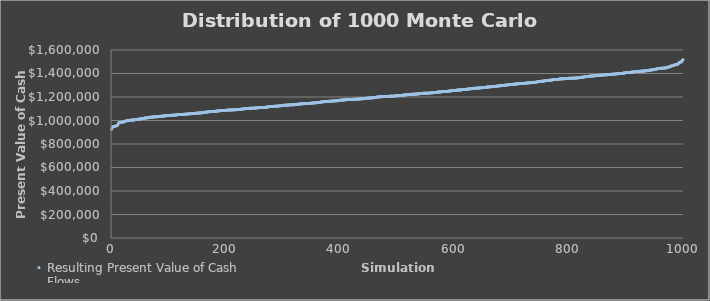
| Category | Resulting Present Value of Cash Flows |
|---|---|
| 0 | 923953.235 |
| 1 | 942751.115 |
| 2 | 943107.799 |
| 3 | 947489.846 |
| 4 | 947634.425 |
| 5 | 948893.349 |
| 6 | 949835.916 |
| 7 | 953370.071 |
| 8 | 954506.456 |
| 9 | 957458.929 |
| 10 | 958610.411 |
| 11 | 960805.645 |
| 12 | 976433.237 |
| 13 | 980958.894 |
| 14 | 983151.384 |
| 15 | 983854.451 |
| 16 | 984056.374 |
| 17 | 984367.303 |
| 18 | 985392.041 |
| 19 | 985464.978 |
| 20 | 986260.068 |
| 21 | 988174.473 |
| 22 | 990942.176 |
| 23 | 991568.046 |
| 24 | 993565.666 |
| 25 | 996117.555 |
| 26 | 997082.595 |
| 27 | 999191.633 |
| 28 | 1000311.454 |
| 29 | 1000491.718 |
| 30 | 1000514.084 |
| 31 | 1000994.201 |
| 32 | 1001676.945 |
| 33 | 1002463.129 |
| 34 | 1002574.115 |
| 35 | 1003533.318 |
| 36 | 1003634.504 |
| 37 | 1004115.168 |
| 38 | 1004352.263 |
| 39 | 1004792.354 |
| 40 | 1006242.007 |
| 41 | 1007100.56 |
| 42 | 1007272.898 |
| 43 | 1007994.609 |
| 44 | 1009017.469 |
| 45 | 1009068.399 |
| 46 | 1011062.646 |
| 47 | 1011720.852 |
| 48 | 1011821.242 |
| 49 | 1012646.482 |
| 50 | 1012709.366 |
| 51 | 1013240.801 |
| 52 | 1014438.163 |
| 53 | 1015306.698 |
| 54 | 1015332.948 |
| 55 | 1016437.929 |
| 56 | 1017389.427 |
| 57 | 1018799.663 |
| 58 | 1020434.752 |
| 59 | 1021143.177 |
| 60 | 1021473.589 |
| 61 | 1022108.028 |
| 62 | 1022406.377 |
| 63 | 1022479.199 |
| 64 | 1023441.979 |
| 65 | 1024668.91 |
| 66 | 1025789.487 |
| 67 | 1027802.579 |
| 68 | 1027834.05 |
| 69 | 1027840.406 |
| 70 | 1028557.481 |
| 71 | 1029066.117 |
| 72 | 1029609.214 |
| 73 | 1029748.09 |
| 74 | 1030295.147 |
| 75 | 1030987.74 |
| 76 | 1031202.606 |
| 77 | 1031348.194 |
| 78 | 1031501.864 |
| 79 | 1031539.671 |
| 80 | 1031867.178 |
| 81 | 1031868.171 |
| 82 | 1032796.603 |
| 83 | 1033289.965 |
| 84 | 1035172.42 |
| 85 | 1035348.55 |
| 86 | 1035519.295 |
| 87 | 1037140.524 |
| 88 | 1037146.299 |
| 89 | 1037469.414 |
| 90 | 1037626.013 |
| 91 | 1037688.967 |
| 92 | 1038278.715 |
| 93 | 1039502.721 |
| 94 | 1040480.464 |
| 95 | 1040565.702 |
| 96 | 1041041.71 |
| 97 | 1041953.386 |
| 98 | 1042270.511 |
| 99 | 1042284.306 |
| 100 | 1042340.241 |
| 101 | 1042356.052 |
| 102 | 1043368.837 |
| 103 | 1043948.374 |
| 104 | 1044099.22 |
| 105 | 1044346.623 |
| 106 | 1044823.921 |
| 107 | 1044956.803 |
| 108 | 1045137.406 |
| 109 | 1045205.545 |
| 110 | 1045297.61 |
| 111 | 1046464.327 |
| 112 | 1046698.667 |
| 113 | 1046903.049 |
| 114 | 1048425.637 |
| 115 | 1049271.727 |
| 116 | 1050037.227 |
| 117 | 1050183.094 |
| 118 | 1050208.231 |
| 119 | 1050515.642 |
| 120 | 1050728.775 |
| 121 | 1050809.85 |
| 122 | 1050896.644 |
| 123 | 1051337.087 |
| 124 | 1051602.556 |
| 125 | 1051902.131 |
| 126 | 1052525.044 |
| 127 | 1053638.29 |
| 128 | 1053691.254 |
| 129 | 1053858.558 |
| 130 | 1054273.474 |
| 131 | 1054413.38 |
| 132 | 1054988.406 |
| 133 | 1055659.097 |
| 134 | 1055787.91 |
| 135 | 1056568.799 |
| 136 | 1057187.448 |
| 137 | 1057448.054 |
| 138 | 1057532.342 |
| 139 | 1057659.173 |
| 140 | 1058509.346 |
| 141 | 1059151.853 |
| 142 | 1059352.133 |
| 143 | 1059788.373 |
| 144 | 1059998.501 |
| 145 | 1060304.52 |
| 146 | 1060359.14 |
| 147 | 1061753.644 |
| 148 | 1061767.131 |
| 149 | 1061902.451 |
| 150 | 1062811.791 |
| 151 | 1063052.804 |
| 152 | 1063668.361 |
| 153 | 1063989.485 |
| 154 | 1064010.879 |
| 155 | 1064299.579 |
| 156 | 1064815.465 |
| 157 | 1064923.523 |
| 158 | 1065674.228 |
| 159 | 1066197.032 |
| 160 | 1067869.774 |
| 161 | 1068627.102 |
| 162 | 1069500.409 |
| 163 | 1069668.188 |
| 164 | 1070168.18 |
| 165 | 1070349.461 |
| 166 | 1070604.477 |
| 167 | 1071605.843 |
| 168 | 1073394.129 |
| 169 | 1074439.218 |
| 170 | 1074674.11 |
| 171 | 1074707.431 |
| 172 | 1075112.371 |
| 173 | 1075557.723 |
| 174 | 1075995.01 |
| 175 | 1076444.259 |
| 176 | 1076926.962 |
| 177 | 1077126.627 |
| 178 | 1077639.644 |
| 179 | 1077707.411 |
| 180 | 1077805.772 |
| 181 | 1078106.423 |
| 182 | 1078498.348 |
| 183 | 1078541.3 |
| 184 | 1079596.582 |
| 185 | 1081232.688 |
| 186 | 1081377.943 |
| 187 | 1081649.775 |
| 188 | 1082886.731 |
| 189 | 1082955.241 |
| 190 | 1083124.688 |
| 191 | 1084012.946 |
| 192 | 1084149.601 |
| 193 | 1084685.884 |
| 194 | 1085195.502 |
| 195 | 1085201.297 |
| 196 | 1085392.316 |
| 197 | 1085490.809 |
| 198 | 1086248.307 |
| 199 | 1086398.35 |
| 200 | 1086635.662 |
| 201 | 1088108.649 |
| 202 | 1088322.709 |
| 203 | 1088343.235 |
| 204 | 1088405.887 |
| 205 | 1088907.524 |
| 206 | 1089036.696 |
| 207 | 1089364.804 |
| 208 | 1089419.524 |
| 209 | 1089521.104 |
| 210 | 1089752.331 |
| 211 | 1089816.987 |
| 212 | 1090258.736 |
| 213 | 1090322.897 |
| 214 | 1090581.962 |
| 215 | 1090970.002 |
| 216 | 1091565.514 |
| 217 | 1091762.02 |
| 218 | 1091889.697 |
| 219 | 1092721.19 |
| 220 | 1093319.769 |
| 221 | 1093359.357 |
| 222 | 1093469.702 |
| 223 | 1094375.943 |
| 224 | 1094846.943 |
| 225 | 1095073.41 |
| 226 | 1095118.664 |
| 227 | 1096212.258 |
| 228 | 1096357.737 |
| 229 | 1098337.99 |
| 230 | 1099346.671 |
| 231 | 1099957.927 |
| 232 | 1100135.935 |
| 233 | 1100213.154 |
| 234 | 1100432.201 |
| 235 | 1100810.435 |
| 236 | 1100943.095 |
| 237 | 1102035.104 |
| 238 | 1102132.465 |
| 239 | 1102549.946 |
| 240 | 1102669.534 |
| 241 | 1103710.267 |
| 242 | 1103877.972 |
| 243 | 1103894.755 |
| 244 | 1104394.866 |
| 245 | 1104897.841 |
| 246 | 1104984.325 |
| 247 | 1105063.895 |
| 248 | 1105356.411 |
| 249 | 1105493.89 |
| 250 | 1105505.078 |
| 251 | 1105811.514 |
| 252 | 1106401.805 |
| 253 | 1107084.802 |
| 254 | 1107525.103 |
| 255 | 1107565.028 |
| 256 | 1107576.281 |
| 257 | 1108754.885 |
| 258 | 1109264.494 |
| 259 | 1109358.77 |
| 260 | 1109530.384 |
| 261 | 1109568.716 |
| 262 | 1109573.508 |
| 263 | 1109603.546 |
| 264 | 1110120.018 |
| 265 | 1110141.024 |
| 266 | 1110174.186 |
| 267 | 1110606.119 |
| 268 | 1111064.632 |
| 269 | 1111435.97 |
| 270 | 1114213.332 |
| 271 | 1114345.354 |
| 272 | 1114480.359 |
| 273 | 1115386.257 |
| 274 | 1115763.049 |
| 275 | 1116244.788 |
| 276 | 1118911.373 |
| 277 | 1118952.124 |
| 278 | 1119251.486 |
| 279 | 1119958.309 |
| 280 | 1119969.511 |
| 281 | 1119991.362 |
| 282 | 1120188.911 |
| 283 | 1120577.976 |
| 284 | 1120860.039 |
| 285 | 1120880.908 |
| 286 | 1121162.681 |
| 287 | 1121744.177 |
| 288 | 1121747.992 |
| 289 | 1121880.658 |
| 290 | 1122629.616 |
| 291 | 1122753.016 |
| 292 | 1123902.371 |
| 293 | 1124181.796 |
| 294 | 1124562.876 |
| 295 | 1124579.815 |
| 296 | 1124931.689 |
| 297 | 1126439.623 |
| 298 | 1127648.672 |
| 299 | 1128338.66 |
| 300 | 1128823.697 |
| 301 | 1129609.362 |
| 302 | 1130221.838 |
| 303 | 1130353.409 |
| 304 | 1130365.479 |
| 305 | 1130436.643 |
| 306 | 1131175.444 |
| 307 | 1131176.741 |
| 308 | 1131842.775 |
| 309 | 1131850.617 |
| 310 | 1132372.48 |
| 311 | 1132866.942 |
| 312 | 1133134.584 |
| 313 | 1133135.712 |
| 314 | 1133379.427 |
| 315 | 1133435.12 |
| 316 | 1133587.163 |
| 317 | 1133612.491 |
| 318 | 1133854.034 |
| 319 | 1134334.487 |
| 320 | 1134658.56 |
| 321 | 1134713.626 |
| 322 | 1135508.484 |
| 323 | 1135857.702 |
| 324 | 1137226.289 |
| 325 | 1138187.641 |
| 326 | 1138372.884 |
| 327 | 1139398.889 |
| 328 | 1139572.82 |
| 329 | 1139926.199 |
| 330 | 1140815.539 |
| 331 | 1141816.785 |
| 332 | 1142231.71 |
| 333 | 1142583.019 |
| 334 | 1142727.469 |
| 335 | 1142806.724 |
| 336 | 1142983.395 |
| 337 | 1143024.186 |
| 338 | 1143369.243 |
| 339 | 1143567.526 |
| 340 | 1143861.757 |
| 341 | 1143906.991 |
| 342 | 1144190.618 |
| 343 | 1144400.22 |
| 344 | 1144567.556 |
| 345 | 1145268.731 |
| 346 | 1145898.092 |
| 347 | 1145991.507 |
| 348 | 1147201.765 |
| 349 | 1147499.039 |
| 350 | 1147966.388 |
| 351 | 1148471.341 |
| 352 | 1148505.896 |
| 353 | 1148578.239 |
| 354 | 1149923.979 |
| 355 | 1150476.056 |
| 356 | 1150742.995 |
| 357 | 1150804.022 |
| 358 | 1150811.991 |
| 359 | 1151638.85 |
| 360 | 1152464.172 |
| 361 | 1152580.591 |
| 362 | 1152606.491 |
| 363 | 1152699.065 |
| 364 | 1153465.277 |
| 365 | 1156702.342 |
| 366 | 1156712.377 |
| 367 | 1156980.245 |
| 368 | 1158631.312 |
| 369 | 1158697.213 |
| 370 | 1159468.513 |
| 371 | 1160081.729 |
| 372 | 1160093.139 |
| 373 | 1160398.745 |
| 374 | 1160466.429 |
| 375 | 1160898.547 |
| 376 | 1161402.491 |
| 377 | 1162156.269 |
| 378 | 1162760.461 |
| 379 | 1163373.988 |
| 380 | 1163836.237 |
| 381 | 1163839.228 |
| 382 | 1164147.858 |
| 383 | 1164479.181 |
| 384 | 1164812.412 |
| 385 | 1165205.917 |
| 386 | 1165302.469 |
| 387 | 1165408.105 |
| 388 | 1165695.177 |
| 389 | 1165695.177 |
| 390 | 1166497.641 |
| 391 | 1167009.789 |
| 392 | 1167736.177 |
| 393 | 1167903.131 |
| 394 | 1168001.734 |
| 395 | 1168828.217 |
| 396 | 1169553.963 |
| 397 | 1170020.054 |
| 398 | 1172002.573 |
| 399 | 1172357.466 |
| 400 | 1172545.005 |
| 401 | 1172752.917 |
| 402 | 1173009.16 |
| 403 | 1173749.613 |
| 404 | 1173948.273 |
| 405 | 1174723.207 |
| 406 | 1174918.439 |
| 407 | 1175620.054 |
| 408 | 1176083.993 |
| 409 | 1176511.425 |
| 410 | 1176540.589 |
| 411 | 1178153.198 |
| 412 | 1178363.803 |
| 413 | 1178430.524 |
| 414 | 1178655.672 |
| 415 | 1178711.132 |
| 416 | 1178874.566 |
| 417 | 1178944.423 |
| 418 | 1179147.623 |
| 419 | 1179389.427 |
| 420 | 1179607.145 |
| 421 | 1179949.403 |
| 422 | 1180128.227 |
| 423 | 1180361.794 |
| 424 | 1180582.272 |
| 425 | 1181333.597 |
| 426 | 1181449.45 |
| 427 | 1181730.271 |
| 428 | 1182125.127 |
| 429 | 1182129.953 |
| 430 | 1182402.022 |
| 431 | 1182411.098 |
| 432 | 1182447.176 |
| 433 | 1182780.513 |
| 434 | 1183672.784 |
| 435 | 1183738.826 |
| 436 | 1184172.144 |
| 437 | 1184461.659 |
| 438 | 1184777.653 |
| 439 | 1184881.699 |
| 440 | 1185358.703 |
| 441 | 1185963.896 |
| 442 | 1187724.443 |
| 443 | 1188172.753 |
| 444 | 1188318.2 |
| 445 | 1189281.473 |
| 446 | 1190118.052 |
| 447 | 1190220.505 |
| 448 | 1190519.634 |
| 449 | 1190573.125 |
| 450 | 1190950.149 |
| 451 | 1191300.217 |
| 452 | 1191578.966 |
| 453 | 1192233.46 |
| 454 | 1192406.606 |
| 455 | 1193184.281 |
| 456 | 1193429.439 |
| 457 | 1193532.255 |
| 458 | 1193608.769 |
| 459 | 1195239.035 |
| 460 | 1195884.283 |
| 461 | 1196375.683 |
| 462 | 1196922.666 |
| 463 | 1198508.451 |
| 464 | 1199152.367 |
| 465 | 1199762.849 |
| 466 | 1199799.817 |
| 467 | 1200748.162 |
| 468 | 1201124.358 |
| 469 | 1201782.415 |
| 470 | 1201849.337 |
| 471 | 1202109.68 |
| 472 | 1202402.886 |
| 473 | 1202825.249 |
| 474 | 1202836.646 |
| 475 | 1202999.058 |
| 476 | 1203150.861 |
| 477 | 1203215.238 |
| 478 | 1203770.589 |
| 479 | 1204299.428 |
| 480 | 1204760.121 |
| 481 | 1204875.538 |
| 482 | 1205264.663 |
| 483 | 1205348.261 |
| 484 | 1205750.946 |
| 485 | 1206223.634 |
| 486 | 1206780.681 |
| 487 | 1207332.992 |
| 488 | 1207392.278 |
| 489 | 1207394.111 |
| 490 | 1207493.191 |
| 491 | 1207507.854 |
| 492 | 1207517.291 |
| 493 | 1207850.332 |
| 494 | 1207937.797 |
| 495 | 1209157.698 |
| 496 | 1209312.223 |
| 497 | 1210023.35 |
| 498 | 1210357.551 |
| 499 | 1210984.993 |
| 500 | 1211363.248 |
| 501 | 1211478.486 |
| 502 | 1211595.433 |
| 503 | 1211798.809 |
| 504 | 1212658.194 |
| 505 | 1212761.766 |
| 506 | 1213494.063 |
| 507 | 1213686.164 |
| 508 | 1214495.669 |
| 509 | 1215059.586 |
| 510 | 1215480.549 |
| 511 | 1216178.92 |
| 512 | 1217185.567 |
| 513 | 1217315.796 |
| 514 | 1218253.017 |
| 515 | 1218349.321 |
| 516 | 1218402.284 |
| 517 | 1220088.706 |
| 518 | 1220222.195 |
| 519 | 1220502.974 |
| 520 | 1220521.666 |
| 521 | 1221049.38 |
| 522 | 1221739.966 |
| 523 | 1222854.952 |
| 524 | 1222951.696 |
| 525 | 1223098.677 |
| 526 | 1223316.577 |
| 527 | 1223443.667 |
| 528 | 1223630.915 |
| 529 | 1224141.676 |
| 530 | 1224191.085 |
| 531 | 1224389.743 |
| 532 | 1224918.938 |
| 533 | 1225155.192 |
| 534 | 1225506.592 |
| 535 | 1226283.879 |
| 536 | 1226524.284 |
| 537 | 1227445.313 |
| 538 | 1227978.465 |
| 539 | 1228101.482 |
| 540 | 1228567.826 |
| 541 | 1228795.289 |
| 542 | 1229355.324 |
| 543 | 1229821.646 |
| 544 | 1231059.279 |
| 545 | 1231424.293 |
| 546 | 1231562.405 |
| 547 | 1231965.983 |
| 548 | 1231967.341 |
| 549 | 1231968.312 |
| 550 | 1232070.583 |
| 551 | 1232074.194 |
| 552 | 1232727.216 |
| 553 | 1232735.67 |
| 554 | 1232838.35 |
| 555 | 1233237.698 |
| 556 | 1233572.627 |
| 557 | 1234446.131 |
| 558 | 1234987.369 |
| 559 | 1235062.889 |
| 560 | 1235376.184 |
| 561 | 1235977.341 |
| 562 | 1236437.38 |
| 563 | 1237267.095 |
| 564 | 1237471.018 |
| 565 | 1237500.101 |
| 566 | 1237810.806 |
| 567 | 1239051.294 |
| 568 | 1239104.988 |
| 569 | 1240006.012 |
| 570 | 1240830.571 |
| 571 | 1242600.091 |
| 572 | 1242705.517 |
| 573 | 1242954.737 |
| 574 | 1242960.419 |
| 575 | 1243027.984 |
| 576 | 1243251.512 |
| 577 | 1244724.657 |
| 578 | 1245105.163 |
| 579 | 1245648.242 |
| 580 | 1245875.106 |
| 581 | 1246847.241 |
| 582 | 1247174.89 |
| 583 | 1247220.888 |
| 584 | 1247292.064 |
| 585 | 1247898.974 |
| 586 | 1247986.264 |
| 587 | 1248118.104 |
| 588 | 1248340.688 |
| 589 | 1249798.316 |
| 590 | 1250686.933 |
| 591 | 1250857.618 |
| 592 | 1251746.95 |
| 593 | 1251811.15 |
| 594 | 1252139.302 |
| 595 | 1252798.303 |
| 596 | 1253942.296 |
| 597 | 1255473.208 |
| 598 | 1255516.218 |
| 599 | 1255830.063 |
| 600 | 1256370.649 |
| 601 | 1256414.773 |
| 602 | 1256705.957 |
| 603 | 1256958.82 |
| 604 | 1258856.59 |
| 605 | 1258979.885 |
| 606 | 1259043.612 |
| 607 | 1259221.126 |
| 608 | 1259340.527 |
| 609 | 1259411.86 |
| 610 | 1259425.166 |
| 611 | 1259465.96 |
| 612 | 1260909.436 |
| 613 | 1262784.243 |
| 614 | 1262863.421 |
| 615 | 1262973.531 |
| 616 | 1263137.062 |
| 617 | 1263138.116 |
| 618 | 1264851.056 |
| 619 | 1264878.945 |
| 620 | 1265605.667 |
| 621 | 1265822.136 |
| 622 | 1266745.876 |
| 623 | 1267045.408 |
| 624 | 1267923.055 |
| 625 | 1268389.631 |
| 626 | 1268483.897 |
| 627 | 1269709.297 |
| 628 | 1270162.981 |
| 629 | 1271066.644 |
| 630 | 1271252.885 |
| 631 | 1271931.309 |
| 632 | 1272100.837 |
| 633 | 1273189.023 |
| 634 | 1274477.58 |
| 635 | 1274716.236 |
| 636 | 1274793.947 |
| 637 | 1274907.452 |
| 638 | 1275061.385 |
| 639 | 1275318.169 |
| 640 | 1275562.635 |
| 641 | 1276146.063 |
| 642 | 1276360.775 |
| 643 | 1277503.191 |
| 644 | 1277535.113 |
| 645 | 1278128.35 |
| 646 | 1278274.916 |
| 647 | 1278631.448 |
| 648 | 1278784.981 |
| 649 | 1279714.811 |
| 650 | 1280001.586 |
| 651 | 1280222.371 |
| 652 | 1280767.183 |
| 653 | 1280768.344 |
| 654 | 1280916.09 |
| 655 | 1282207.847 |
| 656 | 1284979.816 |
| 657 | 1284998.071 |
| 658 | 1285321.737 |
| 659 | 1285547.515 |
| 660 | 1285703.175 |
| 661 | 1285957.271 |
| 662 | 1286686.812 |
| 663 | 1287065.742 |
| 664 | 1287231.336 |
| 665 | 1288262.958 |
| 666 | 1288564.501 |
| 667 | 1288795.485 |
| 668 | 1288967.391 |
| 669 | 1289088.379 |
| 670 | 1289344.276 |
| 671 | 1290499.384 |
| 672 | 1291013.926 |
| 673 | 1292368.427 |
| 674 | 1292967.158 |
| 675 | 1292993.048 |
| 676 | 1293633.717 |
| 677 | 1294663.538 |
| 678 | 1295497.569 |
| 679 | 1295554.579 |
| 680 | 1295749.708 |
| 681 | 1296282.088 |
| 682 | 1296935.272 |
| 683 | 1297718.514 |
| 684 | 1298588.283 |
| 685 | 1298695.32 |
| 686 | 1299851.617 |
| 687 | 1300892.409 |
| 688 | 1300909.871 |
| 689 | 1300953.282 |
| 690 | 1301237.526 |
| 691 | 1302405.396 |
| 692 | 1302603.111 |
| 693 | 1302785.617 |
| 694 | 1304453.922 |
| 695 | 1304888.488 |
| 696 | 1305830.973 |
| 697 | 1306093.189 |
| 698 | 1306325.765 |
| 699 | 1306424.426 |
| 700 | 1306717.228 |
| 701 | 1307109.023 |
| 702 | 1307871.028 |
| 703 | 1308173.236 |
| 704 | 1308885.081 |
| 705 | 1310021.289 |
| 706 | 1310558.154 |
| 707 | 1310604.121 |
| 708 | 1311024.204 |
| 709 | 1311603.689 |
| 710 | 1311957.434 |
| 711 | 1312979.882 |
| 712 | 1313061.229 |
| 713 | 1313569.915 |
| 714 | 1314505.945 |
| 715 | 1314627.616 |
| 716 | 1315423.76 |
| 717 | 1315551.562 |
| 718 | 1315701.384 |
| 719 | 1315888.725 |
| 720 | 1315906.505 |
| 721 | 1316252.949 |
| 722 | 1316669.085 |
| 723 | 1317453.199 |
| 724 | 1317763.196 |
| 725 | 1318216.422 |
| 726 | 1318455.065 |
| 727 | 1319217.001 |
| 728 | 1319952.983 |
| 729 | 1320142.745 |
| 730 | 1320936.385 |
| 731 | 1321251.373 |
| 732 | 1321371.121 |
| 733 | 1321498.829 |
| 734 | 1322433.386 |
| 735 | 1323360.26 |
| 736 | 1323788.489 |
| 737 | 1324595.377 |
| 738 | 1324690.918 |
| 739 | 1324719.587 |
| 740 | 1325204.686 |
| 741 | 1325226.955 |
| 742 | 1325274.786 |
| 743 | 1326679.749 |
| 744 | 1328848.452 |
| 745 | 1330279.134 |
| 746 | 1330339.723 |
| 747 | 1330448.867 |
| 748 | 1330692.501 |
| 749 | 1331770.925 |
| 750 | 1331951.683 |
| 751 | 1333664.668 |
| 752 | 1333952.878 |
| 753 | 1334131.286 |
| 754 | 1335340.135 |
| 755 | 1335507.262 |
| 756 | 1335955.476 |
| 757 | 1337412.569 |
| 758 | 1338827.259 |
| 759 | 1338967.716 |
| 760 | 1339166.063 |
| 761 | 1339758.849 |
| 762 | 1340427.661 |
| 763 | 1341571.685 |
| 764 | 1341721.312 |
| 765 | 1342277.547 |
| 766 | 1342284.745 |
| 767 | 1342582.573 |
| 768 | 1342762.042 |
| 769 | 1343147.449 |
| 770 | 1346419.127 |
| 771 | 1346779.515 |
| 772 | 1347083.181 |
| 773 | 1347939.472 |
| 774 | 1348233.347 |
| 775 | 1348259.986 |
| 776 | 1348303.238 |
| 777 | 1348814.385 |
| 778 | 1349679.895 |
| 779 | 1349851.186 |
| 780 | 1350101.133 |
| 781 | 1350390.251 |
| 782 | 1351377.826 |
| 783 | 1352584.911 |
| 784 | 1353700.256 |
| 785 | 1353946.631 |
| 786 | 1354106.258 |
| 787 | 1354526.84 |
| 788 | 1354788.005 |
| 789 | 1354805.099 |
| 790 | 1355181.131 |
| 791 | 1355793.447 |
| 792 | 1355940.481 |
| 793 | 1356101.333 |
| 794 | 1356392.468 |
| 795 | 1356695.035 |
| 796 | 1357076.695 |
| 797 | 1357891.212 |
| 798 | 1357973.817 |
| 799 | 1359044.308 |
| 800 | 1359197.655 |
| 801 | 1359278.008 |
| 802 | 1359527.211 |
| 803 | 1359554.222 |
| 804 | 1359795.639 |
| 805 | 1360188.699 |
| 806 | 1360213.824 |
| 807 | 1360274.969 |
| 808 | 1360781.999 |
| 809 | 1361108.438 |
| 810 | 1361484.062 |
| 811 | 1361671.793 |
| 812 | 1361758.669 |
| 813 | 1362062.737 |
| 814 | 1362192.673 |
| 815 | 1362253.298 |
| 816 | 1363761.942 |
| 817 | 1364140.741 |
| 818 | 1364356.456 |
| 819 | 1365705.562 |
| 820 | 1366897.079 |
| 821 | 1367600.126 |
| 822 | 1368044.115 |
| 823 | 1368263.996 |
| 824 | 1368616.8 |
| 825 | 1370014.144 |
| 826 | 1371072.273 |
| 827 | 1372449.738 |
| 828 | 1372476.738 |
| 829 | 1372688.278 |
| 830 | 1374976.37 |
| 831 | 1375021.087 |
| 832 | 1375039.909 |
| 833 | 1375243.671 |
| 834 | 1376601.396 |
| 835 | 1376726.412 |
| 836 | 1377151.997 |
| 837 | 1377546.267 |
| 838 | 1377712.625 |
| 839 | 1378755.772 |
| 840 | 1378830.986 |
| 841 | 1378940.085 |
| 842 | 1379195.491 |
| 843 | 1379396.703 |
| 844 | 1379815.18 |
| 845 | 1380352.688 |
| 846 | 1381293.237 |
| 847 | 1381978.776 |
| 848 | 1382287.542 |
| 849 | 1382538.027 |
| 850 | 1383837.079 |
| 851 | 1384269.928 |
| 852 | 1384604.269 |
| 853 | 1384963.648 |
| 854 | 1385221.274 |
| 855 | 1385513.925 |
| 856 | 1385884.301 |
| 857 | 1385936.548 |
| 858 | 1386233.17 |
| 859 | 1386467.692 |
| 860 | 1387431.891 |
| 861 | 1387854.501 |
| 862 | 1388472.814 |
| 863 | 1388933.088 |
| 864 | 1389171.043 |
| 865 | 1389307.412 |
| 866 | 1389461.733 |
| 867 | 1389610.962 |
| 868 | 1390661.124 |
| 869 | 1391348.418 |
| 870 | 1391901.286 |
| 871 | 1392064.885 |
| 872 | 1392094.052 |
| 873 | 1392658.765 |
| 874 | 1392820.048 |
| 875 | 1393744.8 |
| 876 | 1394003.929 |
| 877 | 1394399.826 |
| 878 | 1394488.852 |
| 879 | 1394553.368 |
| 880 | 1395176.647 |
| 881 | 1396159.367 |
| 882 | 1396285.979 |
| 883 | 1397071.561 |
| 884 | 1398014.042 |
| 885 | 1398183.068 |
| 886 | 1398552.63 |
| 887 | 1398807.822 |
| 888 | 1399210.124 |
| 889 | 1399365.763 |
| 890 | 1399380.663 |
| 891 | 1400130.677 |
| 892 | 1400821.096 |
| 893 | 1401357.95 |
| 894 | 1402580.642 |
| 895 | 1403777.818 |
| 896 | 1404164.738 |
| 897 | 1404868.833 |
| 898 | 1405203.656 |
| 899 | 1406946.516 |
| 900 | 1407509.369 |
| 901 | 1407803.701 |
| 902 | 1407977.906 |
| 903 | 1408146.291 |
| 904 | 1408468.667 |
| 905 | 1408531.816 |
| 906 | 1409305.996 |
| 907 | 1409414.986 |
| 908 | 1409458.243 |
| 909 | 1412361.248 |
| 910 | 1412444.486 |
| 911 | 1412663.161 |
| 912 | 1412855.519 |
| 913 | 1413264.607 |
| 914 | 1414784.672 |
| 915 | 1416416.907 |
| 916 | 1416882.367 |
| 917 | 1417018.965 |
| 918 | 1417628.245 |
| 919 | 1417637.762 |
| 920 | 1417807.625 |
| 921 | 1418032.479 |
| 922 | 1418453.248 |
| 923 | 1418486.492 |
| 924 | 1418784.954 |
| 925 | 1419059.434 |
| 926 | 1419610.328 |
| 927 | 1419637.708 |
| 928 | 1420752.01 |
| 929 | 1420772.119 |
| 930 | 1421554.414 |
| 931 | 1421622.756 |
| 932 | 1421760.098 |
| 933 | 1422482.167 |
| 934 | 1422671.697 |
| 935 | 1422897.683 |
| 936 | 1424140.145 |
| 937 | 1424461.514 |
| 938 | 1424709.346 |
| 939 | 1425122.449 |
| 940 | 1427241.645 |
| 941 | 1428288.186 |
| 942 | 1428670.699 |
| 943 | 1429166.776 |
| 944 | 1430856.09 |
| 945 | 1431682.477 |
| 946 | 1431910.062 |
| 947 | 1432387.716 |
| 948 | 1432476.554 |
| 949 | 1433582.046 |
| 950 | 1433819.179 |
| 951 | 1434232.246 |
| 952 | 1437733.865 |
| 953 | 1438506.699 |
| 954 | 1440618.19 |
| 955 | 1440697.796 |
| 956 | 1441863.506 |
| 957 | 1442920.033 |
| 958 | 1443434.561 |
| 959 | 1443807.677 |
| 960 | 1444236.72 |
| 961 | 1444423.58 |
| 962 | 1444611.753 |
| 963 | 1445488.298 |
| 964 | 1445967.444 |
| 965 | 1446038.878 |
| 966 | 1446425.346 |
| 967 | 1446460.459 |
| 968 | 1446743.231 |
| 969 | 1447403.45 |
| 970 | 1448189.587 |
| 971 | 1450776.861 |
| 972 | 1452535.622 |
| 973 | 1454457.663 |
| 974 | 1454597.79 |
| 975 | 1456043.352 |
| 976 | 1457838.336 |
| 977 | 1461523.837 |
| 978 | 1461825.318 |
| 979 | 1463363.039 |
| 980 | 1465272.608 |
| 981 | 1467751.696 |
| 982 | 1468209.175 |
| 983 | 1469080.048 |
| 984 | 1473336.715 |
| 985 | 1473743.066 |
| 986 | 1473769.933 |
| 987 | 1475245.96 |
| 988 | 1475491.778 |
| 989 | 1477173.273 |
| 990 | 1479213.249 |
| 991 | 1487073.931 |
| 992 | 1488142.693 |
| 993 | 1493481.701 |
| 994 | 1498064.342 |
| 995 | 1498411.962 |
| 996 | 1499216.487 |
| 997 | 1500629.59 |
| 998 | 1513080.161 |
| 999 | 1518099.737 |